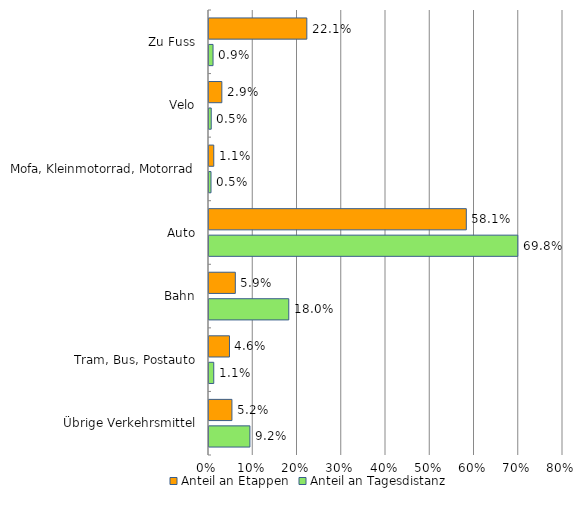
| Category | Anteil an Etappen | Anteil an Tagesdistanz |
|---|---|---|
| Zu Fuss | 22.108 | 0.913 |
| Velo | 2.905 | 0.504 |
| Mofa, Kleinmotorrad, Motorrad | 1.077 | 0.454 |
| Auto | 58.15 | 69.786 |
| Bahn | 5.949 | 18.026 |
| Tram, Bus, Postauto | 4.629 | 1.074 |
| Übrige Verkehrsmittel | 5.181 | 9.243 |